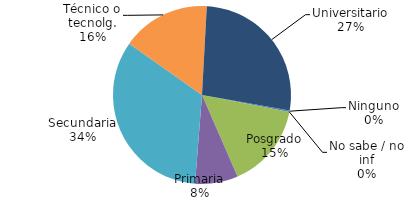
| Category | Series 0 |
|---|---|
| Ninguno | 5.307 |
| No sabe / no inf | 0 |
| Posgrado | 296.891 |
| Primaria | 150.112 |
| Secundaria | 646.142 |
| Técnico o tecnolg. | 309.742 |
| Universitario | 518.687 |